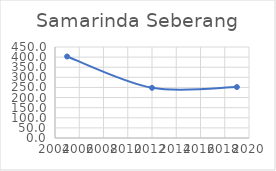
| Category | Series 0 |
|---|---|
| 2005.0 | 402.897 |
| 2012.0 | 248.094 |
| 2019.0 | 251.926 |